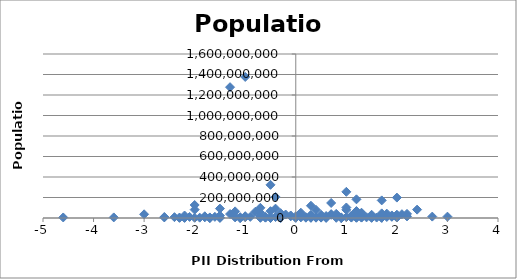
| Category | Population |
|---|---|
| -3.5999999999999996 | 5707251 |
| -2.5999999999999996 | 5488543 |
| -2.5999999999999996 | 9875378 |
| -2.1999999999999997 | 4691480 |
| -1.7999999999999998 | 17000059 |
| -4.6 | 5214900 |
| -2.4 | 8211700 |
| -1.0999999999999996 | 8211700 |
| -3.0 | 36048521 |
| -2.0 | 81459000 |
| -2.1999999999999997 | 562958 |
| -1.2000000000000002 | 64716000 |
| -2.1999999999999997 | 24104700 |
| -0.5 | 332529 |
| -1.7999999999999998 | 11250585 |
| -2.1999999999999997 | 8662588 |
| -0.5 | 323625762 |
| -1.7999999999999998 | 7234800 |
| -1.2000000000000002 | 6378000 |
| -2.0 | 126919659 |
| -0.5999999999999996 | 3324460 |
| -1.7000000000000002 | 2545603 |
| -0.7000000000000002 | 18006407 |
| 0.9000000000000004 | 1315944 |
| -0.5 | 66689000 |
| -1.7000000000000002 | 5779760 |
| -0.5 | 742737 |
| -1.0999999999999996 | 2155784 |
| -1.0 | 10427301 |
| -1.2999999999999998 | 38483957 |
| -1.5 | 23476640 |
| -1.7000000000000002 | 1141166 |
| -0.2999999999999998 | 8502900 |
| 0.2999999999999998 | 2875593 |
| -2.0 | 2063077 |
| -0.2999999999999998 | 46423064 |
| -2.0999999999999996 | 10553443 |
| -0.7000000000000002 | 50801405 |
| -1.0999999999999996 | 445426 |
| -0.2999999999999998 | 525000 |
| -2.3 | 4586353 |
| 0.9000000000000004 | 1973700 |
| -1.7000000000000002 | 92000 |
| -0.8999999999999995 | 11262564 |
| -0.39999999999999947 | 9531712 |
| -2.3 | 1261208 |
| 0.0 | 2113077 |
| 0.5 | 3720400 |
| 0.2999999999999998 | 30770375 |
| -0.2999999999999998 | 1343000 |
| 0.2999999999999998 | 4284889 |
| 0.2999999999999998 | 9855571 |
| -0.2999999999999998 | 5426252 |
| 0.7000000000000002 | 31068000 |
| -0.2999999999999998 | 4187161 |
| -1.5999999999999996 | 11238317 |
| 0.10000000000000053 | 27000000 |
| 0.5 | 10955000 |
| 0.6000000000000005 | 19511000 |
| -1.9 | 3286936 |
| -0.7999999999999998 | 60674003 |
| 1.2000000000000002 | 2067000 |
| 0.6000000000000005 | 676872 |
| 1.7000000000000002 | 13567338 |
| 1.2000000000000002 | 54956900 |
| -1.5 | 190428 |
| 0.7999999999999998 | 2069162 |
| 1.0 | 79463663 |
| 0.20000000000000018 | 7202198 |
| 0.20000000000000018 | 2950210 |
| 0.6000000000000005 | 7041599 |
| -0.5999999999999996 | 6377195 |
| 0.2999999999999998 | 3081677 |
| 1.2999999999999998 | 3929141 |
| -1.0999999999999996 | 1349667 |
| 1.7000000000000002 | 3871643 |
| -0.39999999999999947 | 205338000 |
| 1.1000000000000005 | 17322796 |
| -1.2999999999999998 | 1276267000 |
| 1.2000000000000002 | 67959000 |
| -1.2000000000000002 | 10982754 |
| 2.0 | 16212000 |
| 0.10000000000000053 | 10879829 |
| -1.0 | 1376049000 |
| 1.2000000000000002 | 48663285 |
| 1.6000000000000005 | 4503000 |
| 1.5 | 20277597 |
| 0.40000000000000036 | 2886026 |
| 0.7999999999999998 | 40400000 |
| -0.39999999999999947 | 91162000 |
| 1.0 | 255461700 |
| -0.20000000000000018 | 33848242 |
| 1.2000000000000002 | 31151643 |
| 0.0 | 2998600 |
| 1.2000000000000002 | 14517176 |
| 0.2999999999999998 | 119530753 |
| 1.0 | 102580000 |
| 1.9000000000000004 | 11410651 |
| -0.7000000000000002 | 1475000 |
| 1.7000000000000002 | 17138707 |
| 1.7999999999999998 | 9980243 |
| -0.7000000000000002 | 99465819 |
| 1.7000000000000002 | 2913281 |
| 1.2999999999999998 | 43417000 |
| -1.0 | 9498700 |
| 2.0 | 23919000 |
| 1.9000000000000004 | 16144000 |
| -0.5 | 7552318 |
| 1.0 | 8249574 |
| -0.09999999999999964 | 16407000 |
| 1.1000000000000005 | 4067564 |
| -0.09999999999999964 | 24692144 |
| -1.5 | 91700000 |
| 2.0 | 199085847 |
| 0.10000000000000053 | 51820000 |
| -0.5999999999999996 | 9754830 |
| 0.9000000000000004 | 735554 |
| 0.7000000000000002 | 146600000 |
| 1.4000000000000004 | 6190280 |
| 0.9000000000000004 | 1882450 |
| 0.7999999999999998 | 15806675 |
| -1.0 | 17693500 |
| 1.2999999999999998 | 6000000 |
| 1.2000000000000002 | 4467000 |
| 1.2999999999999998 | 22434363 |
| 1.5 | 1201542 |
| 1.1000000000000005 | 22534532 |
| 0.40000000000000036 | 79200000 |
| 1.7000000000000002 | 26494504 |
| 0.10000000000000053 | 6167237 |
| 0.6000000000000005 | 6783272 |
| 1.7999999999999998 | 42539010 |
| 1.2000000000000002 | 182202000 |
| 1.2999999999999998 | 8610000 |
| 1.7000000000000002 | 171700000 |
| 1.7000000000000002 | 8746128 |
| 1.7000000000000002 | 45010056 |
| -0.7000000000000002 | 6803699 |
| 1.1000000000000005 | 7059653 |
| 0.7000000000000002 | 37873253 |
| 2.0 | 4709000 |
| 0.5 | 4662446 |
| 2.7 | 13670084 |
| 2.3999999999999995 | 81680000 |
| 1.2999999999999998 | 51486253 |
| 1.1000000000000005 | 11178921 |
| 2.2 | 15458332 |
| 3.000000000000001 | 12973808 |
| 0.5 | 31576400 |
| 0.9000000000000004 | 6380803 |
| 0.0 | 17064854 |
| 0.40000000000000036 | 5171943 |
| 0.2999999999999998 | 25408000 |
| 2.0 | 10604000 |
| 1.7000000000000002 | 1693398 |
| 1.5 | 31416000 |
| 2.1000000000000005 | 37056169 |
| -1.5 | 6411776 |
| 1.7999999999999998 | 24383301 |
| 2.2 | 40235000 |
| 2.0 | 32564342 |
| 1.9000000000000004 | 24895000 |